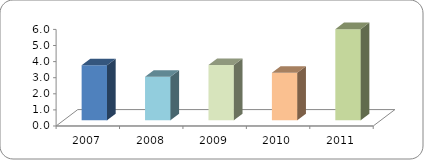
| Category | COBERTURA DE BECADOS EXTERNOS |
|---|---|
| 2007.0 | 3.419 |
| 2008.0 | 2.7 |
| 2009.0 | 3.433 |
| 2010.0 | 2.953 |
| 2011.0 | 5.659 |